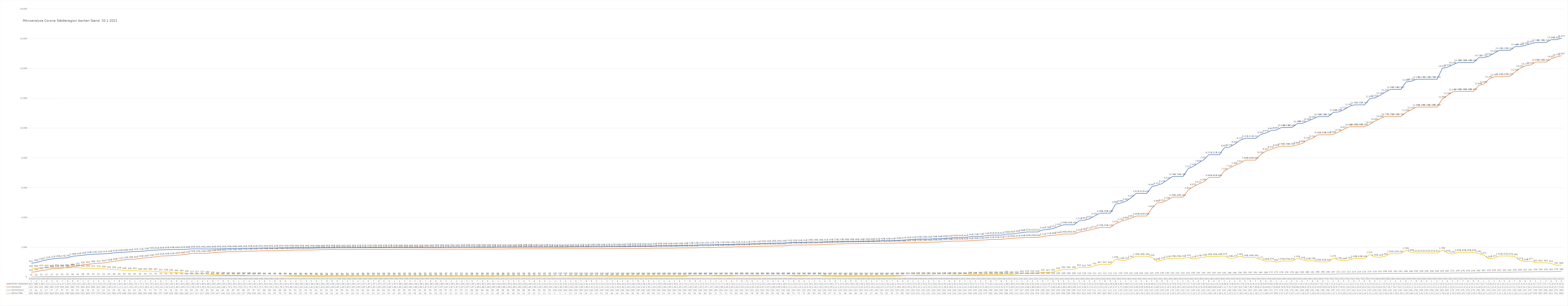
| Category | Positiv Getestete | Genesene | Verstorbene | Aktive Fälle |
|---|---|---|---|---|
| 3/31/20 | 922 | 322 | 15 | 585 |
| 4/1/20 | 980 | 364 | 16 | 600 |
| 4/2/20 | 1081 | 435 | 21 | 625 |
| 4/3/20 | 1155 | 494 | 27 | 634 |
| 4/4/20 | 1213 | 560 | 27 | 626 |
| 4/5/20 | 1259 | 578 | 27 | 654 |
| 4/6/20 | 1272 | 595 | 35 | 642 |
| 4/7/20 | 1295 | 662 | 35 | 598 |
| 4/8/20 | 1399 | 699 | 36 | 664 |
| 4/9/20 | 1426 | 755 | 41 | 630 |
| 4/10/20 | 1465 | 826 | 48 | 591 |
| 4/11/20 | 1508 | 854 | 50 | 604 |
| 4/12/20 | 1532 | 906 | 51 | 575 |
| 4/13/20 | 1547 | 922 | 51 | 574 |
| 4/14/20 | 1557 | 949 | 52 | 556 |
| 4/15/20 | 1583 | 1009 | 54 | 520 |
| 4/16/20 | 1623 | 1058 | 56 | 509 |
| 4/17/20 | 1650 | 1112 | 59 | 479 |
| 4/18/20 | 1669 | 1159 | 62 | 448 |
| 4/19/20 | 1693 | 1195 | 62 | 436 |
| 4/20/20 | 1707 | 1201 | 63 | 443 |
| 4/21/20 | 1719 | 1256 | 65 | 398 |
| 4/22/20 | 1754 | 1281 | 70 | 403 |
| 4/23/20 | 1797 | 1324 | 73 | 400 |
| 4/24/20 | 1812 | 1357 | 74 | 381 |
| 4/25/20 | 1824 | 1412 | 75 | 337 |
| 4/26/20 | 1835 | 1420 | 76 | 339 |
| 4/27/20 | 1839 | 1435 | 76 | 328 |
| 4/28/20 | 1845 | 1467 | 78 | 300 |
| 4/29/20 | 1853 | 1490 | 79 | 284 |
| 4/30/20 | 1866 | 1535 | 82 | 249 |
| 5/1/20 | 1891 | 1591 | 83 | 217 |
| 5/2/20 | 1891 | 1591 | 83 | 217 |
| 5/3/20 | 1891 | 1591 | 83 | 217 |
| 5/4/20 | 1885 | 1598 | 83 | 204 |
| 5/5/20 | 1890 | 1636 | 84 | 170 |
| 5/6/20 | 1895 | 1664 | 84 | 147 |
| 5/7/20 | 1903 | 1682 | 85 | 136 |
| 5/8/20 | 1909 | 1702 | 85 | 122 |
| 5/9/20 | 1909 | 1702 | 85 | 122 |
| 5/10/20 | 1909 | 1702 | 85 | 122 |
| 5/11/20 | 1924 | 1721 | 86 | 117 |
| 5/12/20 | 1929 | 1736 | 87 | 106 |
| 5/13/20 | 1934 | 1743 | 87 | 104 |
| 5/14/20 | 1941 | 1753 | 87 | 101 |
| 5/15/20 | 1945 | 1764 | 88 | 93 |
| 5/16/20 | 1945 | 1764 | 88 | 93 |
| 5/17/20 | 1945 | 1764 | 88 | 93 |
| 5/18/20 | 1951 | 1784 | 88 | 79 |
| 5/19/20 | 1952 | 1791 | 89 | 72 |
| 5/20/20 | 1958 | 1801 | 91 | 66 |
| 5/21/20 | 1960 | 1814 | 91 | 55 |
| 5/22/20 | 1960 | 1814 | 91 | 55 |
| 5/23/20 | 1960 | 1814 | 91 | 55 |
| 5/24/20 | 1960 | 1814 | 91 | 55 |
| 5/25/20 | 1960 | 1829 | 91 | 40 |
| 5/26/20 | 1960 | 1839 | 91 | 30 |
| 5/27/20 | 1962 | 1846 | 92 | 24 |
| 5/28/20 | 1964 | 1849 | 92 | 23 |
| 5/29/20 | 1967 | 1850 | 93 | 24 |
| 5/30/20 | 1967 | 1850 | 93 | 24 |
| 5/31/20 | 1967 | 1850 | 93 | 24 |
| 6/1/20 | 1967 | 1850 | 93 | 24 |
| 6/2/20 | 1971 | 1856 | 93 | 22 |
| 6/3/20 | 1972 | 1858 | 94 | 20 |
| 6/4/20 | 1975 | 1859 | 94 | 22 |
| 6/5/20 | 1976 | 1859 | 94 | 23 |
| 6/6/20 | 1976 | 1859 | 94 | 23 |
| 6/7/20 | 1976 | 1859 | 94 | 23 |
| 6/8/20 | 1979 | 1862 | 94 | 23 |
| 6/9/20 | 1979 | 1863 | 94 | 22 |
| 6/10/20 | 1980 | 1865 | 95 | 20 |
| 6/11/20 | 1982 | 1869 | 95 | 18 |
| 6/12/20 | 1982 | 1869 | 95 | 18 |
| 6/13/20 | 1982 | 1869 | 95 | 18 |
| 6/14/20 | 1982 | 1869 | 95 | 18 |
| 6/15/20 | 1982 | 1871 | 95 | 16 |
| 6/16/20 | 1982 | 1871 | 95 | 16 |
| 6/17/20 | 1985 | 1871 | 95 | 19 |
| 6/18/20 | 1985 | 1871 | 95 | 19 |
| 6/19/20 | 1991 | 1873 | 97 | 21 |
| 6/20/20 | 1991 | 1873 | 97 | 21 |
| 6/21/20 | 1991 | 1873 | 97 | 21 |
| 6/22/20 | 1994 | 1875 | 97 | 22 |
| 6/23/20 | 1994 | 1875 | 97 | 22 |
| 6/24/20 | 1997 | 1876 | 98 | 23 |
| 6/25/20 | 1999 | 1880 | 98 | 21 |
| 6/26/20 | 1999 | 1880 | 98 | 21 |
| 6/27/20 | 1999 | 1880 | 98 | 21 |
| 6/28/20 | 1999 | 1880 | 98 | 21 |
| 6/29/20 | 2001 | 1883 | 98 | 20 |
| 6/30/20 | 2001 | 1883 | 98 | 20 |
| 7/1/20 | 2004 | 1890 | 98 | 16 |
| 7/2/20 | 2004 | 1890 | 98 | 16 |
| 7/3/20 | 2009 | 1898 | 98 | 13 |
| 7/4/20 | 2009 | 1898 | 98 | 13 |
| 7/5/20 | 2009 | 1898 | 98 | 13 |
| 7/6/20 | 2010 | 1900 | 98 | 12 |
| 7/7/20 | 2010 | 1900 | 99 | 11 |
| 7/8/20 | 2010 | 1900 | 99 | 11 |
| 7/9/20 | 2010 | 1900 | 99 | 11 |
| 7/10/20 | 2011 | 1908 | 100 | 3 |
| 7/11/20 | 2011 | 1908 | 100 | 3 |
| 7/12/20 | 2011 | 1908 | 100 | 3 |
| 7/13/20 | 2021 | 1908 | 100 | 13 |
| 7/14/20 | 2021 | 1908 | 100 | 13 |
| 7/15/20 | 2025 | 1909 | 100 | 16 |
| 7/16/20 | 2025 | 1909 | 100 | 16 |
| 7/17/20 | 2030 | 1917 | 100 | 13 |
| 7/18/20 | 2030 | 1917 | 100 | 13 |
| 7/19/20 | 2030 | 1917 | 100 | 13 |
| 7/20/20 | 2037 | 1917 | 100 | 20 |
| 7/21/20 | 2037 | 1917 | 100 | 20 |
| 7/22/20 | 2044 | 1920 | 100 | 24 |
| 7/23/20 | 2044 | 1920 | 100 | 24 |
| 7/24/20 | 2058 | 1922 | 100 | 36 |
| 7/25/20 | 2067 | 1928 | 100 | 39 |
| 7/26/20 | 2067 | 1928 | 100 | 39 |
| 7/27/20 | 2067 | 1928 | 100 | 39 |
| 7/28/20 | 2067 | 1928 | 100 | 39 |
| 7/29/20 | 2076 | 1937 | 100 | 39 |
| 7/30/20 | 2095 | 1942 | 100 | 53 |
| 7/31/20 | 2095 | 1942 | 100 | 53 |
| 8/1/20 | 2095 | 1942 | 100 | 53 |
| 8/2/20 | 2095 | 1942 | 100 | 53 |
| 8/3/20 | 2108 | 1954 | 100 | 54 |
| 8/4/20 | 2108 | 1954 | 100 | 54 |
| 8/5/20 | 2139 | 1958 | 100 | 81 |
| 8/6/20 | 2139 | 1958 | 100 | 81 |
| 8/7/20 | 2157 | 1975 | 100 | 82 |
| 8/8/20 | 2157 | 1975 | 100 | 82 |
| 8/9/20 | 2157 | 1975 | 100 | 82 |
| 8/10/20 | 2170 | 1999 | 100 | 71 |
| 8/11/20 | 2170 | 1999 | 100 | 71 |
| 8/12/20 | 2181 | 2008 | 101 | 72 |
| 8/13/20 | 2181 | 2008 | 101 | 72 |
| 8/14/20 | 2212 | 2028 | 101 | 83 |
| 8/15/20 | 2212 | 2028 | 101 | 83 |
| 8/16/20 | 2212 | 2028 | 101 | 83 |
| 8/17/20 | 2232 | 2053 | 101 | 78 |
| 8/18/20 | 2232 | 2053 | 101 | 78 |
| 8/19/20 | 2261 | 2074 | 102 | 85 |
| 8/20/20 | 2261 | 2074 | 102 | 85 |
| 8/21/20 | 2281 | 2087 | 102 | 92 |
| 8/22/20 | 2281 | 2087 | 102 | 92 |
| 8/23/20 | 2281 | 2087 | 102 | 92 |
| 8/24/20 | 2311 | 2120 | 102 | 89 |
| 8/25/20 | 2324 | 2149 | 102 | 73 |
| 8/26/20 | 2324 | 2149 | 102 | 73 |
| 8/27/20 | 2324 | 2149 | 102 | 73 |
| 8/28/20 | 2348 | 2163 | 102 | 83 |
| 8/29/20 | 2348 | 2163 | 102 | 83 |
| 8/30/20 | 2348 | 2163 | 102 | 83 |
| 8/31/20 | 2353 | 2193 | 102 | 58 |
| 9/1/20 | 2363 | 2203 | 103 | 57 |
| 9/2/20 | 2370 | 2216 | 103 | 51 |
| 9/3/20 | 2378 | 2224 | 103 | 51 |
| 9/4/20 | 2384 | 2235 | 103 | 46 |
| 9/5/20 | 2384 | 2235 | 103 | 46 |
| 9/6/20 | 2384 | 2235 | 103 | 46 |
| 9/7/20 | 2389 | 2247 | 103 | 39 |
| 9/8/20 | 2393 | 2258 | 103 | 32 |
| 9/9/20 | 2400 | 2260 | 103 | 37 |
| 9/10/20 | 2412 | 2263 | 103 | 46 |
| 9/11/20 | 2429 | 2271 | 103 | 55 |
| 9/12/20 | 2429 | 2271 | 103 | 55 |
| 9/13/20 | 2429 | 2271 | 103 | 55 |
| 9/14/20 | 2459 | 2283 | 103 | 73 |
| 9/15/20 | 2477 | 2288 | 103 | 86 |
| 9/16/20 | 2503 | 2297 | 103 | 103 |
| 9/17/20 | 2522 | 2309 | 103 | 110 |
| 9/18/20 | 2550 | 2326 | 103 | 121 |
| 9/19/20 | 2550 | 2326 | 103 | 121 |
| 9/20/20 | 2550 | 2326 | 103 | 121 |
| 9/21/20 | 2568 | 2350 | 104 | 114 |
| 9/22/20 | 2568 | 2350 | 104 | 114 |
| 9/23/20 | 2600 | 2387 | 104 | 109 |
| 9/24/20 | 2621 | 2398 | 104 | 119 |
| 9/25/20 | 2643 | 2415 | 104 | 124 |
| 9/26/20 | 2643 | 2415 | 104 | 124 |
| 9/27/20 | 2643 | 2415 | 104 | 124 |
| 9/28/20 | 2707 | 2442 | 105 | 160 |
| 9/29/20 | 2718 | 2464 | 105 | 149 |
| 9/30/20 | 2734 | 2476 | 106 | 152 |
| 10/1/20 | 2776 | 2495 | 106 | 175 |
| 10/2/20 | 2812 | 2524 | 106 | 182 |
| 10/3/20 | 2812 | 2524 | 106 | 182 |
| 10/4/20 | 2812 | 2524 | 106 | 182 |
| 10/5/20 | 2883 | 2571 | 106 | 206 |
| 10/6/20 | 2891 | 2601 | 107 | 183 |
| 10/7/20 | 2936 | 2617 | 107 | 212 |
| 10/8/20 | 2988 | 2638 | 107 | 243 |
| 10/9/20 | 3027 | 2664 | 109 | 254 |
| 10/10/20 | 3027 | 2664 | 109 | 254 |
| 10/11/20 | 3027 | 2664 | 109 | 254 |
| 10/12/20 | 3167 | 2723 | 109 | 335 |
| 10/13/20 | 3188 | 2772 | 109 | 307 |
| 10/14/20 | 3257 | 2806 | 109 | 342 |
| 10/15/20 | 3393 | 2845 | 109 | 439 |
| 10/16/20 | 3509 | 2891 | 109 | 509 |
| 10/17/20 | 3509 | 2891 | 109 | 509 |
| 10/18/20 | 3509 | 2891 | 109 | 509 |
| 10/19/20 | 3778 | 3016 | 110 | 652 |
| 10/20/20 | 3816 | 3084 | 110 | 622 |
| 10/21/20 | 3912 | 3157 | 110 | 645 |
| 10/22/20 | 4103 | 3237 | 111 | 755 |
| 10/23/20 | 4288 | 3330 | 111 | 847 |
| 10/24/20 | 4288 | 3330 | 111 | 847 |
| 10/25/20 | 4288 | 3330 | 111 | 847 |
| 10/26/20 | 4889 | 3574 | 111 | 1204 |
| 10/27/20 | 4969 | 3734 | 116 | 1119 |
| 10/28/20 | 5082 | 3840 | 119 | 1123 |
| 10/29/20 | 5316 | 3953 | 122 | 1241 |
| 10/30/20 | 5612 | 4093 | 124 | 1395 |
| 10/31/20 | 5612 | 4093 | 124 | 1395 |
| 11/1/20 | 5612 | 4093 | 124 | 1395 |
| 11/2/20 | 6061 | 4610 | 125 | 1326 |
| 11/3/20 | 6153 | 4966 | 129 | 1058 |
| 11/4/20 | 6278 | 5013 | 130 | 1135 |
| 11/5/20 | 6519 | 5166 | 130 | 1223 |
| 11/6/20 | 6748 | 5360 | 132 | 1256 |
| 11/7/20 | 6748 | 5360 | 132 | 1256 |
| 11/8/20 | 6748 | 5360 | 132 | 1256 |
| 11/9/20 | 7273 | 5831 | 132 | 1310 |
| 11/10/20 | 7426 | 6076 | 140 | 1210 |
| 11/11/20 | 7658 | 6237 | 142 | 1279 |
| 11/12/20 | 7871 | 6394 | 143 | 1334 |
| 11/13/20 | 8211 | 6683 | 143 | 1385 |
| 11/14/20 | 8211 | 6683 | 143 | 1385 |
| 11/15/20 | 8211 | 6683 | 143 | 1385 |
| 11/16/20 | 8681 | 7124 | 143 | 1414 |
| 11/17/20 | 8728 | 7322 | 148 | 1258 |
| 11/18/20 | 8920 | 7498 | 148 | 1274 |
| 11/19/20 | 9179 | 7631 | 156 | 1392 |
| 11/20/20 | 9311 | 7849 | 162 | 1300 |
| 11/21/20 | 9311 | 7849 | 162 | 1300 |
| 11/22/20 | 9311 | 7849 | 162 | 1300 |
| 11/23/20 | 9565 | 8230 | 164 | 1171 |
| 11/24/20 | 9676 | 8447 | 168 | 1061 |
| 11/25/20 | 9827 | 8576 | 172 | 1079 |
| 11/26/20 | 9867 | 8698 | 175 | 994 |
| 11/27/20 | 10038 | 8786 | 178 | 1074 |
| 11/28/20 | 10038 | 8786 | 178 | 1074 |
| 11/29/20 | 10038 | 8786 | 178 | 1074 |
| 11/30/20 | 10289 | 8868 | 182 | 1239 |
| 12/1/20 | 10316 | 8968 | 184 | 1164 |
| 12/2/20 | 10460 | 9194 | 188 | 1078 |
| 12/3/20 | 10605 | 9314 | 191 | 1100 |
| 12/4/20 | 10764 | 9548 | 196 | 1020 |
| 12/5/20 | 10764 | 9548 | 196 | 1020 |
| 12/6/20 | 10764 | 9548 | 196 | 1020 |
| 12/7/20 | 11053 | 9586 | 197 | 1270 |
| 12/8/20 | 11080 | 9730 | 211 | 1139 |
| 12/9/20 | 11222 | 9915 | 213 | 1094 |
| 12/10/20 | 11442 | 10086 | 213 | 1143 |
| 12/11/20 | 11557 | 10095 | 214 | 1248 |
| 12/12/20 | 11557 | 10095 | 214 | 1248 |
| 12/13/20 | 11557 | 10095 | 214 | 1248 |
| 12/14/20 | 11970 | 10237 | 219 | 1514 |
| 12/15/20 | 12025 | 10461 | 219 | 1345 |
| 12/16/20 | 12197 | 10640 | 232 | 1325 |
| 12/17/20 | 12415 | 10773 | 240 | 1402 |
| 12/18/20 | 12592 | 10783 | 242 | 1567 |
| 12/19/20 | 12592 | 10783 | 242 | 1567 |
| 12/20/20 | 12592 | 10783 | 242 | 1567 |
| 12/21/20 | 13089 | 11054 | 246 | 1789 |
| 12/22/20 | 13144 | 11232 | 246 | 1666 |
| 12/23/20 | 13276 | 11409 | 256 | 1611 |
| 12/24/20 | 13276 | 11409 | 256 | 1611 |
| 12/25/20 | 13276 | 11409 | 256 | 1611 |
| 12/26/20 | 13276 | 11409 | 256 | 1611 |
| 12/27/20 | 13276 | 11409 | 256 | 1611 |
| 12/28/20 | 14012 | 11950 | 263 | 1799 |
| 12/29/20 | 14078 | 12189 | 265 | 1624 |
| 12/30/20 | 14248 | 12435 | 272 | 1541 |
| 12/31/20 | 14395 | 12460 | 276 | 1659 |
| 1/1/21 | 14395 | 12460 | 276 | 1659 |
| 1/2/21 | 14395 | 12460 | 276 | 1659 |
| 1/3/21 | 14395 | 12460 | 276 | 1659 |
| 1/4/21 | 14721 | 12848 | 292 | 1581 |
| 1/5/21 | 14723 | 12949 | 301 | 1473 |
| 1/6/21 | 14832 | 13293 | 310 | 1229 |
| 1/7/21 | 15028 | 13437 | 319 | 1272 |
| 1/8/21 | 15211 | 13473 | 325 | 1413 |
| 1/9/21 | 15211 | 13473 | 325 | 1413 |
| 1/10/21 | 15211 | 13473 | 325 | 1413 |
| 1/11/21 | 15460 | 13759 | 335 | 1366 |
| 1/12/21 | 15469 | 14015 | 340 | 1114 |
| 1/13/21 | 15548 | 14173 | 347 | 1028 |
| 1/14/21 | 15657 | 14233 | 347 | 1077 |
| 1/15/21 | 15745 | 14431 | 359 | 955 |
| 1/16/21 | 15745 | 14431 | 359 | 955 |
| 1/17/21 | 15745 | 14431 | 359 | 955 |
| 1/18/21 | 15931 | 14657 | 362 | 912 |
| 1/19/21 | 15933 | 14772 | 370 | 791 |
| 1/20/21 | 16037 | 14857 | 380 | 800 |